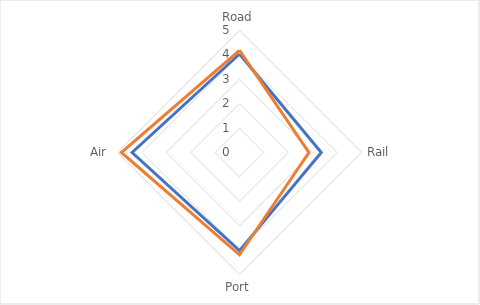
| Category | Global Average | Kenya |
|---|---|---|
| Road | 4.037 | 4.188 |
| Rail | 3.351 | 2.844 |
| Port | 4.022 | 4.193 |
| Air | 4.401 | 4.843 |